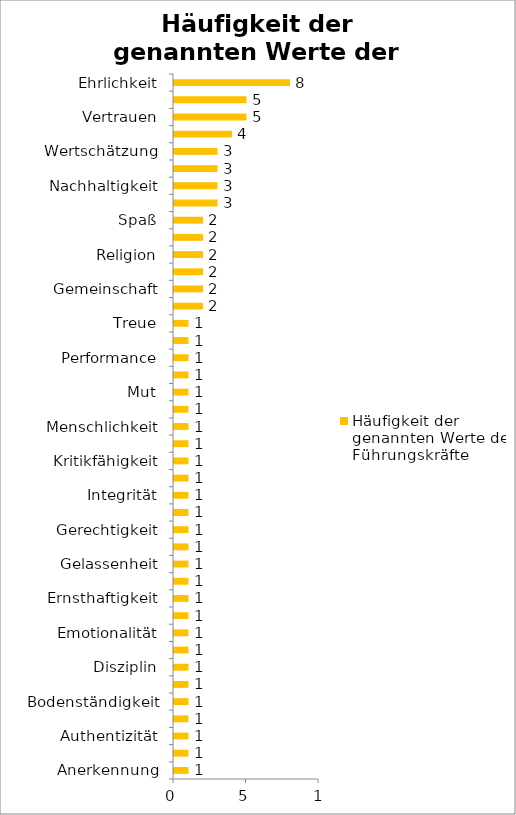
| Category | Häufigkeit der genannten Werte der Führungskräfte |
|---|---|
| Anerkennung | 1 |
| Aufrichtigkeit | 1 |
| Authentizität | 1 |
| Beweglichkeit | 1 |
| Bodenständigkeit | 1 |
| Dankbarkeit | 1 |
| Disziplin | 1 |
| Effizienz | 1 |
| Emotionalität | 1 |
| Erfolg | 1 |
| Ernsthaftigkeit | 1 |
| Geduld | 1 |
| Gelassenheit | 1 |
| Geradlinigkeit | 1 |
| Gerechtigkeit | 1 |
| Höflichkeit | 1 |
| Integrität | 1 |
| Kompetenz | 1 |
| Kritikfähigkeit | 1 |
| Loyalität | 1 |
| Menschlichkeit | 1 |
| Mitgefühl | 1 |
| Mut | 1 |
| Offenheit | 1 |
| Performance | 1 |
| Serviceorientierung | 1 |
| Treue | 1 |
| Freundlichkeit | 2 |
| Gemeinschaft | 2 |
| Gewissenhaftigkeit | 2 |
| Religion | 2 |
| Respekt | 2 |
| Spaß | 2 |
| Fleiß | 3 |
| Nachhaltigkeit | 3 |
| Toleranz | 3 |
| Wertschätzung | 3 |
| Pünktlichkeit | 4 |
| Vertrauen | 5 |
| Zuverlässigkeit | 5 |
| Ehrlichkeit | 8 |